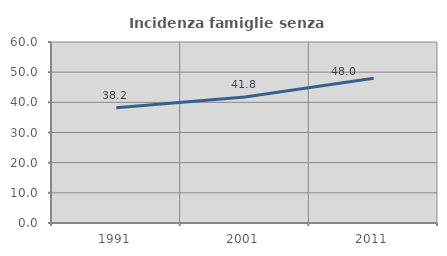
| Category | Incidenza famiglie senza nuclei |
|---|---|
| 1991.0 | 38.166 |
| 2001.0 | 41.756 |
| 2011.0 | 48.012 |